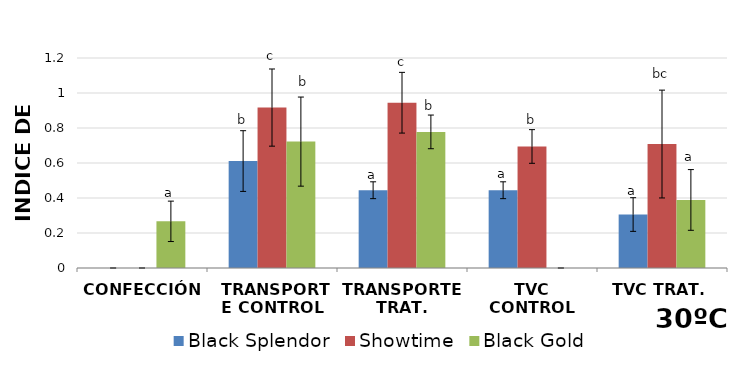
| Category | Black Splendor | Showtime | Black Gold |
|---|---|---|---|
| CONFECCIÓN | 0 | 0 | 0.267 |
|  TRANSPORTE CONTROL | 0.611 | 0.917 | 0.722 |
| TRANSPORTE TRAT. | 0.444 | 0.944 | 0.778 |
| TVC CONTROL | 0.444 | 0.694 | 0 |
| TVC TRAT. | 0.306 | 0.708 | 0.389 |